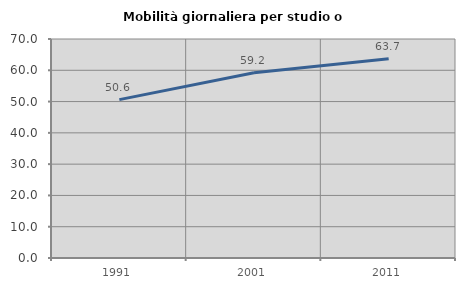
| Category | Mobilità giornaliera per studio o lavoro |
|---|---|
| 1991.0 | 50.629 |
| 2001.0 | 59.218 |
| 2011.0 | 63.658 |